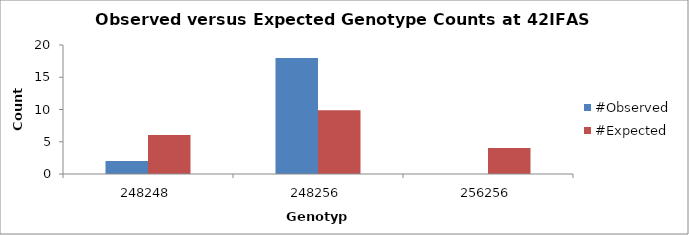
| Category | #Observed | #Expected |
|---|---|---|
| 248248.0 | 2 | 6.05 |
| 248256.0 | 18 | 9.9 |
| 256256.0 | 0 | 4.05 |